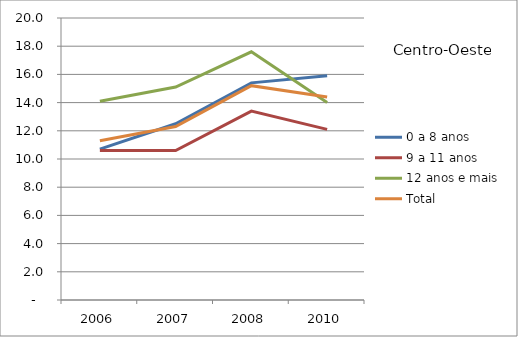
| Category | 0 a 8 anos | 9 a 11 anos | 12 anos e mais | Total |
|---|---|---|---|---|
| 2006.0 | 10.7 | 10.6 | 14.1 | 11.3 |
| 2007.0 | 12.5 | 10.6 | 15.1 | 12.3 |
| 2008.0 | 15.4 | 13.4 | 17.6 | 15.2 |
| 2010.0 | 15.9 | 12.1 | 14 | 14.4 |